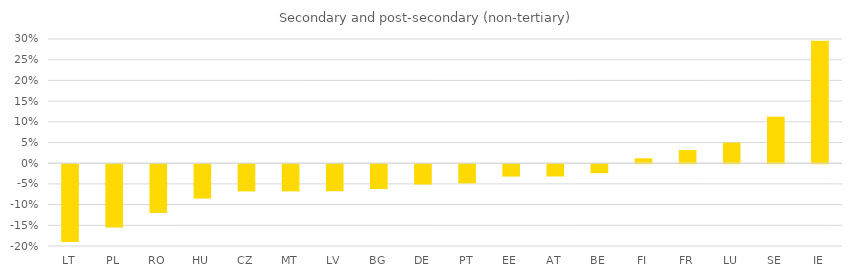
| Category | Secondary and post-secondary (non-tertiary), change in students 2013-2018 |
|---|---|
| LT | -0.188 |
| PL | -0.153 |
| RO | -0.118 |
| HU | -0.083 |
| CZ | -0.066 |
| MT | -0.066 |
| LV | -0.065 |
| BG | -0.06 |
| DE | -0.049 |
| PT | -0.046 |
| EE | -0.03 |
| AT | -0.03 |
| BE | -0.022 |
| FI | 0.012 |
| FR | 0.032 |
| LU | 0.05 |
| SE | 0.112 |
| IE | 0.296 |